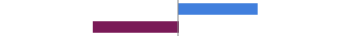
| Category | Series 0 |
|---|---|
| Favorable | 0.444 |
| Unfavorable | -0.481 |